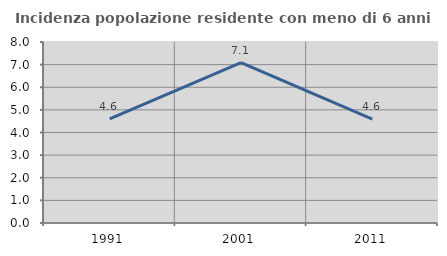
| Category | Incidenza popolazione residente con meno di 6 anni |
|---|---|
| 1991.0 | 4.605 |
| 2001.0 | 7.083 |
| 2011.0 | 4.592 |